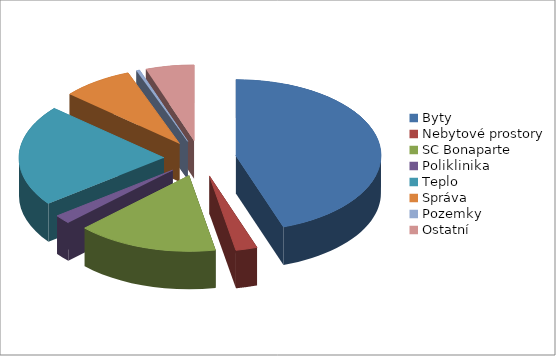
| Category | Series 0 |
|---|---|
| Byty | 1369088.27 |
| Nebytové prostory | 73541.92 |
| SC Bonaparte | 481525.92 |
| Poliklinika | 57643 |
| Teplo | 663717.6 |
| Správa | 242231.3 |
| Pozemky | 11415.81 |
| Ostatní | 165199.99 |